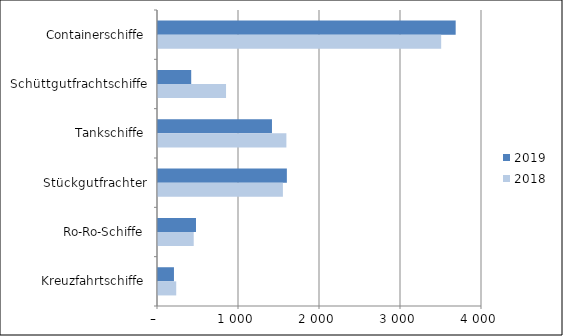
| Category | 2019 | 2018 |
|---|---|---|
| Containerschiffe | 3675 | 3496 |
| Schüttgutfrachtschiffe | 410 | 840 |
| Tankschiffe | 1407 | 1585 |
| Stückgutfrachter | 1591 | 1542 |
| Ro-Ro-Schiffe | 469 | 441 |
| Kreuzfahrtschiffe | 197 | 225 |